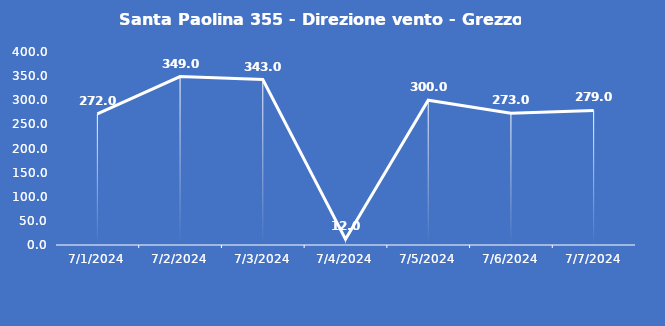
| Category | Santa Paolina 355 - Direzione vento - Grezzo (°N) |
|---|---|
| 7/1/24 | 272 |
| 7/2/24 | 349 |
| 7/3/24 | 343 |
| 7/4/24 | 12 |
| 7/5/24 | 300 |
| 7/6/24 | 273 |
| 7/7/24 | 279 |